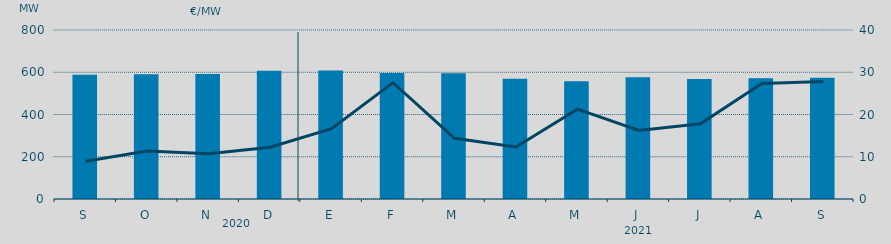
| Category | Energia (MWh) a subir |
|---|---|
| S | 587.738 |
| O | 590.796 |
| N | 591.888 |
| D | 607.198 |
| E | 607.872 |
| F | 595.991 |
| M | 595.541 |
| A | 569.271 |
| M | 557.39 |
| J | 576.589 |
| J | 568.418 |
| A | 571.758 |
| S | 574.157 |